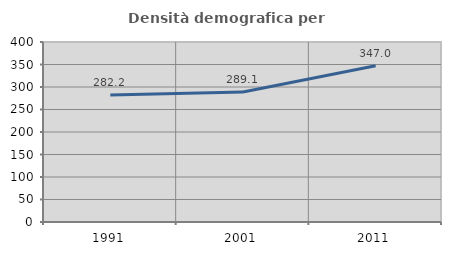
| Category | Densità demografica |
|---|---|
| 1991.0 | 282.216 |
| 2001.0 | 289.087 |
| 2011.0 | 347.045 |